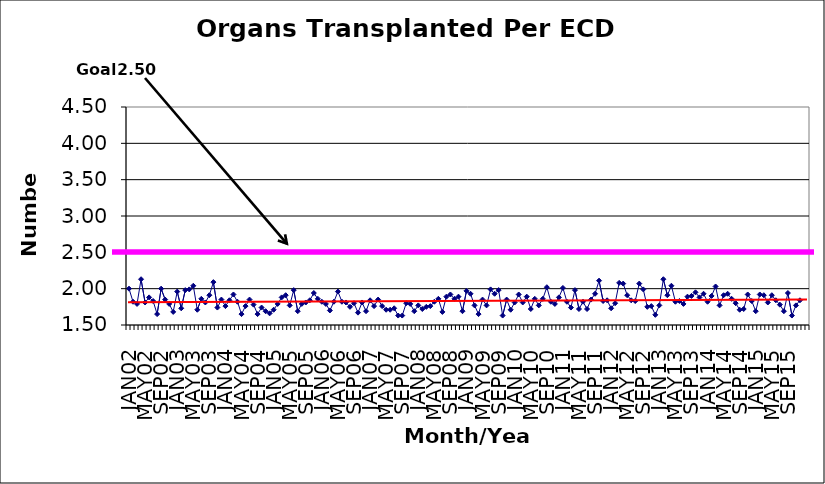
| Category | Series 0 |
|---|---|
| JAN02 | 2 |
| FEB02 | 1.82 |
| MAR02 | 1.79 |
| APR02 | 2.13 |
| MAY02 | 1.81 |
| JUN02 | 1.88 |
| JUL02 | 1.83 |
| AUG02 | 1.65 |
| SEP02 | 2 |
| OCT02 | 1.85 |
| NOV02 | 1.79 |
| DEC02 | 1.68 |
| JAN03 | 1.96 |
| FEB03 | 1.73 |
| MAR03 | 1.98 |
| APR03 | 1.99 |
| MAY03 | 2.04 |
| JUN03 | 1.71 |
| JUL03 | 1.86 |
| AUG03 | 1.81 |
| SEP03 | 1.91 |
| OCT03 | 2.09 |
| NOV03 | 1.74 |
| DEC03 | 1.85 |
| JAN04 | 1.76 |
| FEB04 | 1.84 |
| MAR04 | 1.92 |
| APR04 | 1.82 |
| MAY04 | 1.65 |
| JUN04 | 1.76 |
| JUL04 | 1.85 |
| AUG04 | 1.78 |
| SEP04 | 1.65 |
| OCT04 | 1.74 |
| NOV04 | 1.69 |
| DEC04 | 1.66 |
| JAN05 | 1.71 |
| FEB05 | 1.79 |
| MAR05 | 1.88 |
| APR05 | 1.91 |
| MAY05 | 1.77 |
| JUN05 | 1.98 |
| JUL05 | 1.69 |
| AUG05 | 1.79 |
| SEP05 | 1.81 |
| OCT05 | 1.84 |
| NOV05 | 1.94 |
| DEC05 | 1.86 |
| JAN06 | 1.82 |
| FEB06 | 1.79 |
| MAR06 | 1.7 |
| APR06 | 1.82 |
| MAY06 | 1.96 |
| JUN06 | 1.82 |
| JUL06 | 1.81 |
| AUG06 | 1.75 |
| SEP06 | 1.8 |
| OCT06 | 1.67 |
| NOV06 | 1.81 |
| DEC06 | 1.69 |
| JAN07 | 1.84 |
| FEB07 | 1.76 |
| MAR07 | 1.85 |
| APR07 | 1.76 |
| MAY07 | 1.71 |
| JUN07 | 1.71 |
| JUL07 | 1.73 |
| AUG07 | 1.63 |
| SEP07 | 1.63 |
| OCT07 | 1.8 |
| NOV07 | 1.79 |
| DEC07 | 1.69 |
| JAN08 | 1.77 |
| FEB08 | 1.72 |
| MAR08 | 1.75 |
| APR08 | 1.76 |
| MAY08 | 1.82 |
| JUN08 | 1.86 |
| JUL08 | 1.68 |
| AUG08 | 1.89 |
| SEP08 | 1.92 |
| OCT08 | 1.86 |
| NOV08 | 1.89 |
| DEC08 | 1.69 |
| JAN09 | 1.97 |
| FEB09 | 1.93 |
| MAR09 | 1.77 |
| APR09 | 1.65 |
| MAY09 | 1.85 |
| JUN09 | 1.77 |
| JUL09 | 1.99 |
| AUG09 | 1.93 |
| SEP09 | 1.98 |
| OCT09 | 1.63 |
| NOV09 | 1.85 |
| DEC09 | 1.71 |
| JAN10 | 1.81 |
| FEB10 | 1.92 |
| MAR10 | 1.81 |
| APR10 | 1.89 |
| MAY10 | 1.72 |
| JUN10 | 1.86 |
| JUL10 | 1.77 |
| AUG10 | 1.86 |
| SEP10 | 2.02 |
| OCT10 | 1.82 |
| NOV10 | 1.79 |
| DEC10 | 1.88 |
| JAN11 | 2.01 |
| FEB11 | 1.82 |
| MAR11 | 1.74 |
| APR11 | 1.98 |
| MAY11 | 1.72 |
| JUN11 | 1.82 |
| JUL11 | 1.72 |
| AUG11 | 1.85 |
| SEP11 | 1.93 |
| OCT11 | 2.11 |
| NOV11 | 1.83 |
| DEC11 | 1.84 |
| JAN12 | 1.73 |
| FEB12 | 1.8 |
| MAR12 | 2.08 |
| APR12 | 2.07 |
| MAY12 | 1.91 |
| JUN12 | 1.84 |
| JUL12 | 1.83 |
| AUG12 | 2.07 |
| SEP12 | 1.99 |
| OCT12 | 1.75 |
| NOV12 | 1.76 |
| DEC12 | 1.64 |
| JAN13 | 1.77 |
| FEB13 | 2.13 |
| MAR13 | 1.91 |
| APR13 | 2.04 |
| MAY13 | 1.82 |
| JUN13 | 1.83 |
| JUL13 | 1.79 |
| AUG13 | 1.89 |
| SEP13 | 1.9 |
| OCT13 | 1.95 |
| NOV13 | 1.88 |
| DEC13 | 1.93 |
| JAN14 | 1.82 |
| FEB14 | 1.9 |
| MAR14 | 2.03 |
| APR14 | 1.77 |
| MAY14 | 1.91 |
| JUN14 | 1.93 |
| JUL14 | 1.86 |
| AUG14 | 1.8 |
| SEP14 | 1.71 |
| OCT14 | 1.72 |
| NOV14 | 1.92 |
| DEC14 | 1.83 |
| JAN15 | 1.69 |
| FEB15 | 1.92 |
| MAR15 | 1.91 |
| APR15 | 1.81 |
| MAY15 | 1.91 |
| JUN15 | 1.84 |
| JUL15 | 1.78 |
| AUG15 | 1.69 |
| SEP15 | 1.94 |
| OCT15 | 1.63 |
| NOV15 | 1.77 |
| DEC15 | 1.84 |